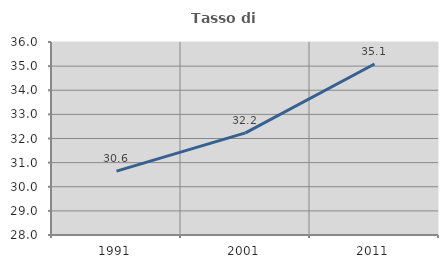
| Category | Tasso di occupazione   |
|---|---|
| 1991.0 | 30.648 |
| 2001.0 | 32.233 |
| 2011.0 | 35.087 |